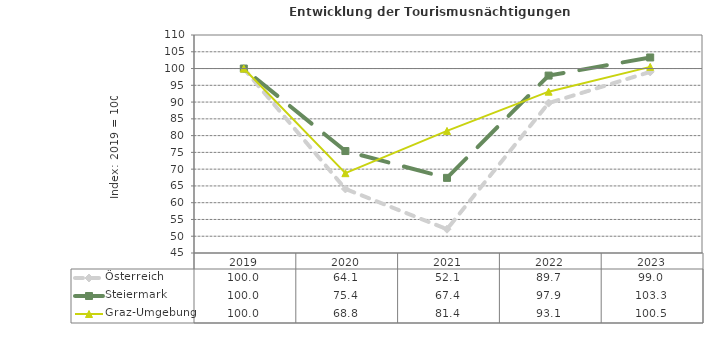
| Category | Österreich | Steiermark | Graz-Umgebung |
|---|---|---|---|
| 2023.0 | 99 | 103.3 | 100.5 |
| 2022.0 | 89.7 | 97.9 | 93.1 |
| 2021.0 | 52.1 | 67.4 | 81.4 |
| 2020.0 | 64.1 | 75.4 | 68.8 |
| 2019.0 | 100 | 100 | 100 |